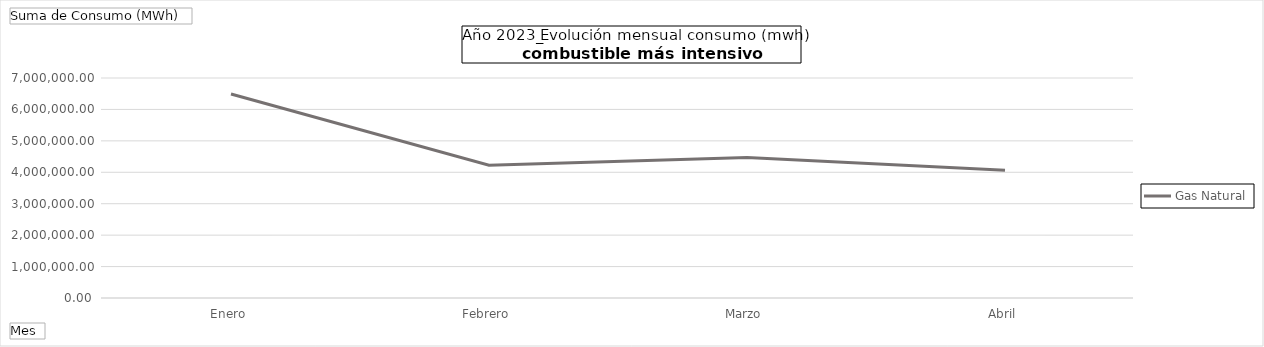
| Category | Gas Natural |
|---|---|
| Enero | 6491613.787 |
| Febrero | 4222741.03 |
| Marzo | 4471293.15 |
| Abril | 4064954.27 |